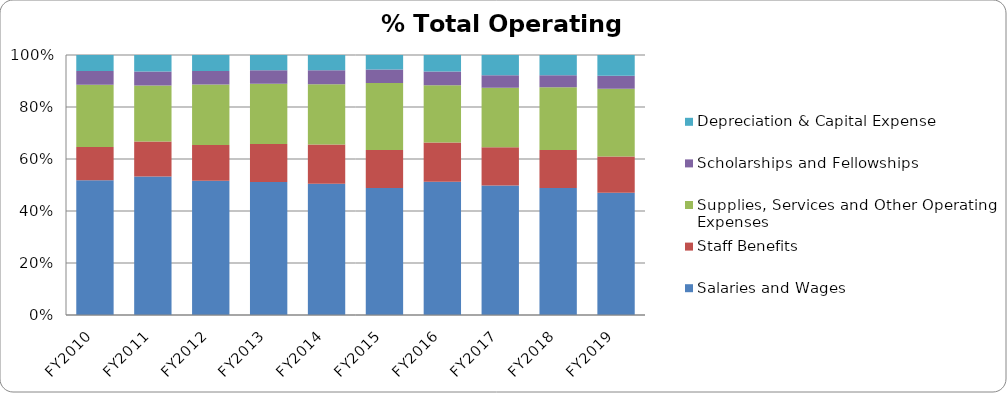
| Category | Salaries and Wages | Staff Benefits | Supplies, Services and Other Operating Expenses | Scholarships and Fellowships | Depreciation & Capital Expense |
|---|---|---|---|---|---|
| FY2010 | 0.519 | 0.127 | 0.24 | 0.052 | 0.062 |
| FY2011 | 0.532 | 0.135 | 0.215 | 0.055 | 0.063 |
| FY2012 | 0.516 | 0.138 | 0.232 | 0.053 | 0.061 |
| FY2013 | 0.511 | 0.147 | 0.231 | 0.053 | 0.058 |
| FY2014 | 0.505 | 0.151 | 0.232 | 0.054 | 0.058 |
| FY2015 | 0.489 | 0.146 | 0.257 | 0.053 | 0.055 |
| FY2016 | 0.512 | 0.151 | 0.22 | 0.053 | 0.064 |
| FY2017 | 0.498 | 0.147 | 0.229 | 0.048 | 0.078 |
| FY2018 | 0.489 | 0.146 | 0.241 | 0.046 | 0.078 |
| FY2019 | 0.47 | 0.14 | 0.26 | 0.05 | 0.08 |